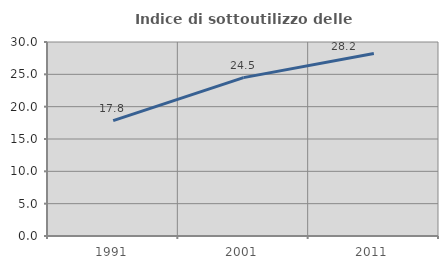
| Category | Indice di sottoutilizzo delle abitazioni  |
|---|---|
| 1991.0 | 17.834 |
| 2001.0 | 24.495 |
| 2011.0 | 28.207 |